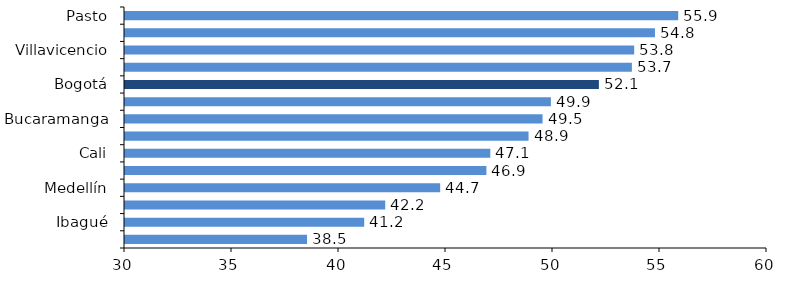
| Category | Series 0 |
|---|---|
| Pasto | 55.852 |
| Montería | 54.764 |
| Villavicencio | 53.793 |
| Cartagena | 53.686 |
| Bogotá | 52.144 |
| Barranquilla | 49.902 |
| Bucaramanga | 49.512 |
| Total 13 áreas | 48.858 |
| Cali | 47.07 |
| Cúcuta | 46.888 |
| Medellín | 44.728 |
| Manizales | 42.16 |
| Ibagué | 41.178 |
| Pereira | 38.506 |